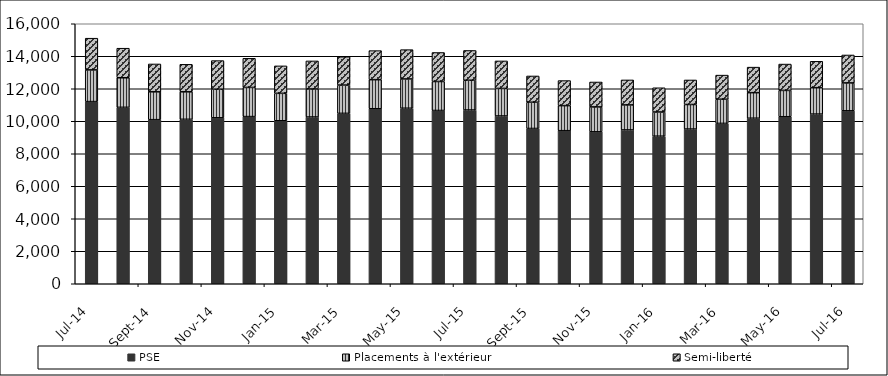
| Category | PSE | Placements à l'extérieur | Semi-liberté |
|---|---|---|---|
| 2014-07-01 | 11210 | 1951 | 1951 |
| 2014-08-01 | 10856 | 1820 | 1820 |
| 2014-09-01 | 10098 | 1714 | 1714 |
| 2014-10-01 | 10120 | 1692 | 1692 |
| 2014-11-01 | 10213 | 1760 | 1760 |
| 2014-12-01 | 10287 | 1794 | 1794 |
| 2015-01-01 | 10030 | 1689 | 1689 |
| 2015-02-01 | 10261 | 1726 | 1726 |
| 2015-03-01 | 10485 | 1742 | 1742 |
| 2015-04-01 | 10770 | 1789 | 1789 |
| 2015-05-01 | 10801 | 1803 | 1803 |
| 2015-06-01 | 10662 | 1785 | 1785 |
| 2015-07-01 | 10692 | 1832 | 1832 |
| 2015-08-01 | 10325 | 1694 | 1694 |
| 2015-09-01 | 9555 | 1616 | 1616 |
| 2015-10-01 | 9420 | 1542 | 1542 |
| 2015-11-01 | 9350 | 1533 | 1533 |
| 2015-12-01 | 9466 | 1539 | 1539 |
| 2016-01-01 | 9081 | 1490 | 1490 |
| 2016-02-01 | 9521 | 1510 | 1510 |
| 2016-03-01 | 9868 | 1486 | 1486 |
| 2016-04-01 | 10187 | 1572 | 1572 |
| 2016-05-01 | 10278 | 1621 | 1621 |
| 2016-06-01 | 10441 | 1625 | 1625 |
| 2016-07-01 | 10642 | 1718 | 1718 |